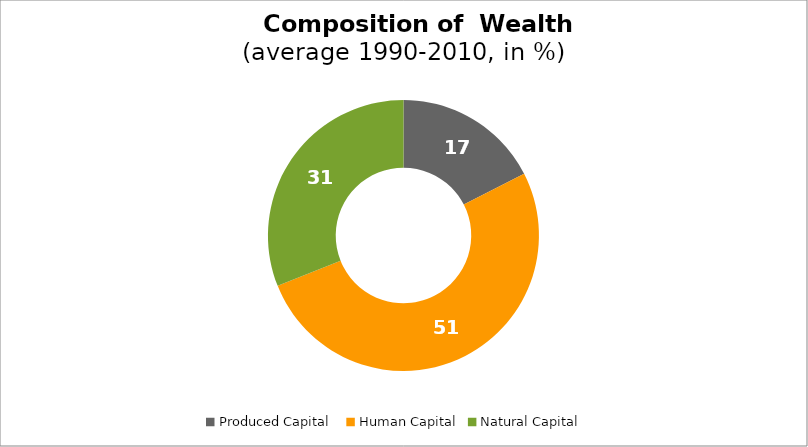
| Category | Series 0 |
|---|---|
| Produced Capital  | 17.468 |
| Human Capital | 51.474 |
| Natural Capital | 31.058 |